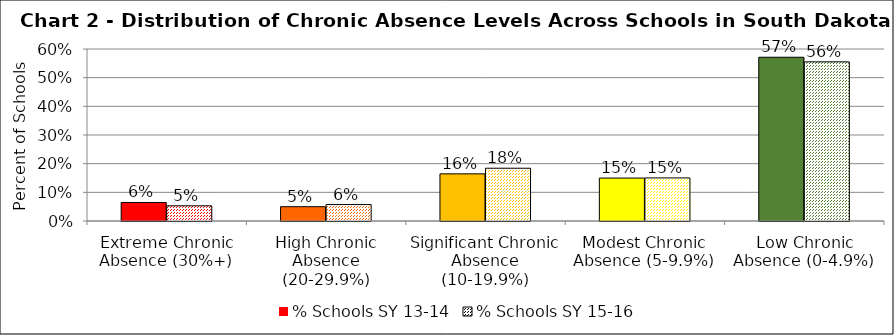
| Category | % Schools SY 13-14 | % Schools SY 15-16 |
|---|---|---|
| Extreme Chronic Absence (30%+) | 0.065 | 0.053 |
| High Chronic Absence (20-29.9%) | 0.05 | 0.057 |
| Significant Chronic Absence (10-19.9%) | 0.164 | 0.184 |
| Modest Chronic Absence (5-9.9%) | 0.15 | 0.15 |
| Low Chronic Absence (0-4.9%) | 0.571 | 0.555 |